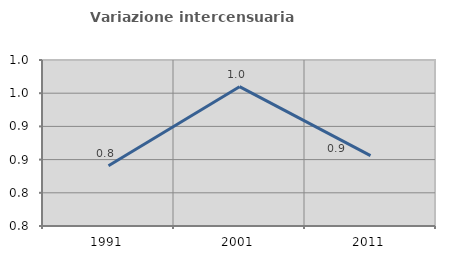
| Category | Variazione intercensuaria annua |
|---|---|
| 1991.0 | 0.841 |
| 2001.0 | 0.96 |
| 2011.0 | 0.856 |